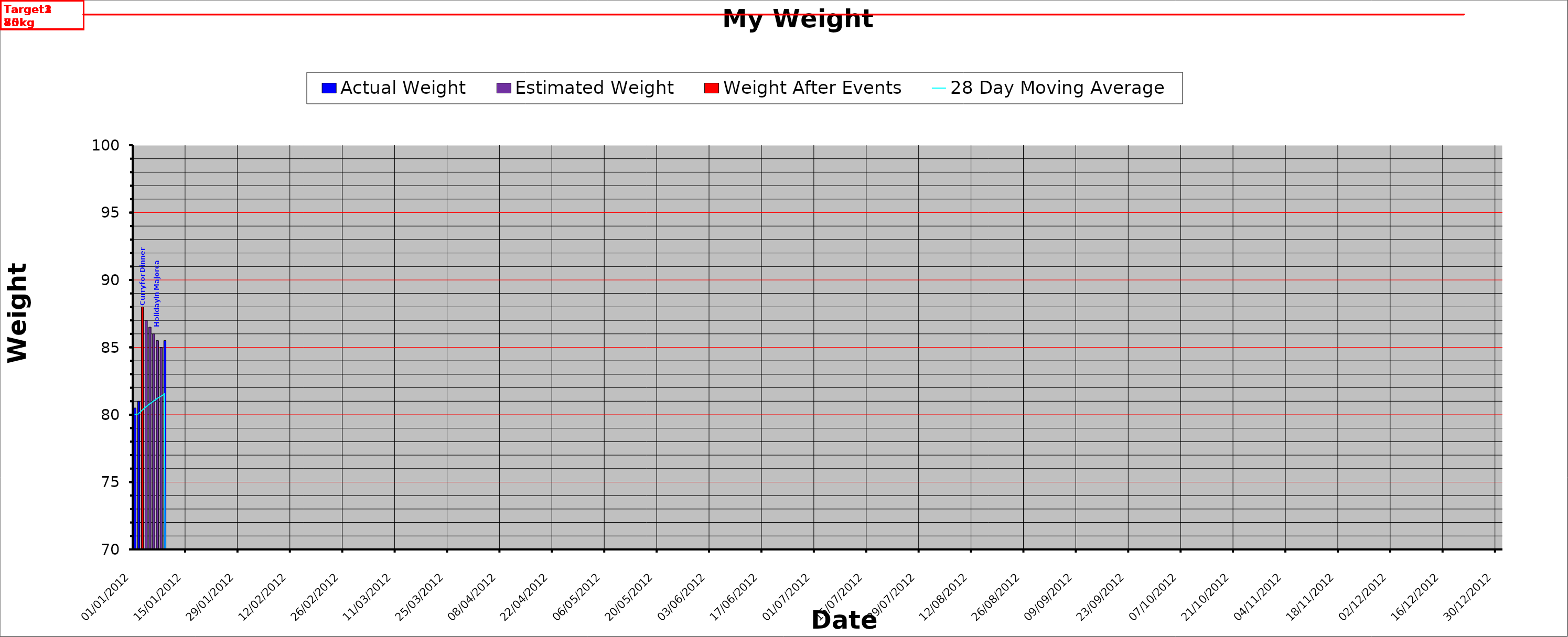
| Category | Actual Weight | Estimated Weight | Weight After Events |
|---|---|---|---|
| 01/01/2012 | 80.5 | 0 | 0 |
| 02/01/2012 | 81 | 0 | 0 |
| 03/01/2012 | 0 | 0 | 88 |
| 04/01/2012 | 0 | 87 | 0 |
| 05/01/2012 | 0 | 86.5 | 0 |
| 06/01/2012 | 0 | 86 | 0 |
| 07/01/2012 | 0 | 85.5 | 0 |
| 08/01/2012 | 0 | 85 | 0 |
| 09/01/2012 | 85.5 | 0 | 0 |
| 10/01/2012 | 0 | 0 | 0 |
| 11/01/2012 | 0 | 0 | 0 |
| 12/01/2012 | 0 | 0 | 0 |
| 13/01/2012 | 0 | 0 | 0 |
| 14/01/2012 | 0 | 0 | 0 |
| 15/01/2012 | 0 | 0 | 0 |
| 16/01/2012 | 0 | 0 | 0 |
| 17/01/2012 | 0 | 0 | 0 |
| 18/01/2012 | 0 | 0 | 0 |
| 19/01/2012 | 0 | 0 | 0 |
| 20/01/2012 | 0 | 0 | 0 |
| 21/01/2012 | 0 | 0 | 0 |
| 22/01/2012 | 0 | 0 | 0 |
| 23/01/2012 | 0 | 0 | 0 |
| 24/01/2012 | 0 | 0 | 0 |
| 25/01/2012 | 0 | 0 | 0 |
| 26/01/2012 | 0 | 0 | 0 |
| 27/01/2012 | 0 | 0 | 0 |
| 28/01/2012 | 0 | 0 | 0 |
| 29/01/2012 | 0 | 0 | 0 |
| 30/01/2012 | 0 | 0 | 0 |
| 31/01/2012 | 0 | 0 | 0 |
| 01/02/2012 | 0 | 0 | 0 |
| 02/02/2012 | 0 | 0 | 0 |
| 03/02/2012 | 0 | 0 | 0 |
| 04/02/2012 | 0 | 0 | 0 |
| 05/02/2012 | 0 | 0 | 0 |
| 06/02/2012 | 0 | 0 | 0 |
| 07/02/2012 | 0 | 0 | 0 |
| 08/02/2012 | 0 | 0 | 0 |
| 09/02/2012 | 0 | 0 | 0 |
| 10/02/2012 | 0 | 0 | 0 |
| 11/02/2012 | 0 | 0 | 0 |
| 12/02/2012 | 0 | 0 | 0 |
| 13/02/2012 | 0 | 0 | 0 |
| 14/02/2012 | 0 | 0 | 0 |
| 15/02/2012 | 0 | 0 | 0 |
| 16/02/2012 | 0 | 0 | 0 |
| 17/02/2012 | 0 | 0 | 0 |
| 18/02/2012 | 0 | 0 | 0 |
| 19/02/2012 | 0 | 0 | 0 |
| 20/02/2012 | 0 | 0 | 0 |
| 21/02/2012 | 0 | 0 | 0 |
| 22/02/2012 | 0 | 0 | 0 |
| 23/02/2012 | 0 | 0 | 0 |
| 24/02/2012 | 0 | 0 | 0 |
| 25/02/2012 | 0 | 0 | 0 |
| 26/02/2012 | 0 | 0 | 0 |
| 27/02/2012 | 0 | 0 | 0 |
| 28/02/2012 | 0 | 0 | 0 |
| 29/02/2012 | 0 | 0 | 0 |
| 01/03/2012 | 0 | 0 | 0 |
| 02/03/2012 | 0 | 0 | 0 |
| 03/03/2012 | 0 | 0 | 0 |
| 04/03/2012 | 0 | 0 | 0 |
| 05/03/2012 | 0 | 0 | 0 |
| 06/03/2012 | 0 | 0 | 0 |
| 07/03/2012 | 0 | 0 | 0 |
| 08/03/2012 | 0 | 0 | 0 |
| 09/03/2012 | 0 | 0 | 0 |
| 10/03/2012 | 0 | 0 | 0 |
| 11/03/2012 | 0 | 0 | 0 |
| 12/03/2012 | 0 | 0 | 0 |
| 13/03/2012 | 0 | 0 | 0 |
| 14/03/2012 | 0 | 0 | 0 |
| 15/03/2012 | 0 | 0 | 0 |
| 16/03/2012 | 0 | 0 | 0 |
| 17/03/2012 | 0 | 0 | 0 |
| 18/03/2012 | 0 | 0 | 0 |
| 19/03/2012 | 0 | 0 | 0 |
| 20/03/2012 | 0 | 0 | 0 |
| 21/03/2012 | 0 | 0 | 0 |
| 22/03/2012 | 0 | 0 | 0 |
| 23/03/2012 | 0 | 0 | 0 |
| 24/03/2012 | 0 | 0 | 0 |
| 25/03/2012 | 0 | 0 | 0 |
| 26/03/2012 | 0 | 0 | 0 |
| 27/03/2012 | 0 | 0 | 0 |
| 28/03/2012 | 0 | 0 | 0 |
| 29/03/2012 | 0 | 0 | 0 |
| 30/03/2012 | 0 | 0 | 0 |
| 31/03/2012 | 0 | 0 | 0 |
| 01/04/2012 | 0 | 0 | 0 |
| 02/04/2012 | 0 | 0 | 0 |
| 03/04/2012 | 0 | 0 | 0 |
| 04/04/2012 | 0 | 0 | 0 |
| 05/04/2012 | 0 | 0 | 0 |
| 06/04/2012 | 0 | 0 | 0 |
| 07/04/2012 | 0 | 0 | 0 |
| 08/04/2012 | 0 | 0 | 0 |
| 09/04/2012 | 0 | 0 | 0 |
| 10/04/2012 | 0 | 0 | 0 |
| 11/04/2012 | 0 | 0 | 0 |
| 12/04/2012 | 0 | 0 | 0 |
| 13/04/2012 | 0 | 0 | 0 |
| 14/04/2012 | 0 | 0 | 0 |
| 15/04/2012 | 0 | 0 | 0 |
| 16/04/2012 | 0 | 0 | 0 |
| 17/04/2012 | 0 | 0 | 0 |
| 18/04/2012 | 0 | 0 | 0 |
| 19/04/2012 | 0 | 0 | 0 |
| 20/04/2012 | 0 | 0 | 0 |
| 21/04/2012 | 0 | 0 | 0 |
| 22/04/2012 | 0 | 0 | 0 |
| 23/04/2012 | 0 | 0 | 0 |
| 24/04/2012 | 0 | 0 | 0 |
| 25/04/2012 | 0 | 0 | 0 |
| 26/04/2012 | 0 | 0 | 0 |
| 27/04/2012 | 0 | 0 | 0 |
| 28/04/2012 | 0 | 0 | 0 |
| 29/04/2012 | 0 | 0 | 0 |
| 30/04/2012 | 0 | 0 | 0 |
| 01/05/2012 | 0 | 0 | 0 |
| 02/05/2012 | 0 | 0 | 0 |
| 03/05/2012 | 0 | 0 | 0 |
| 04/05/2012 | 0 | 0 | 0 |
| 05/05/2012 | 0 | 0 | 0 |
| 06/05/2012 | 0 | 0 | 0 |
| 07/05/2012 | 0 | 0 | 0 |
| 08/05/2012 | 0 | 0 | 0 |
| 09/05/2012 | 0 | 0 | 0 |
| 10/05/2012 | 0 | 0 | 0 |
| 11/05/2012 | 0 | 0 | 0 |
| 12/05/2012 | 0 | 0 | 0 |
| 13/05/2012 | 0 | 0 | 0 |
| 14/05/2012 | 0 | 0 | 0 |
| 15/05/2012 | 0 | 0 | 0 |
| 16/05/2012 | 0 | 0 | 0 |
| 17/05/2012 | 0 | 0 | 0 |
| 18/05/2012 | 0 | 0 | 0 |
| 19/05/2012 | 0 | 0 | 0 |
| 20/05/2012 | 0 | 0 | 0 |
| 21/05/2012 | 0 | 0 | 0 |
| 22/05/2012 | 0 | 0 | 0 |
| 23/05/2012 | 0 | 0 | 0 |
| 24/05/2012 | 0 | 0 | 0 |
| 25/05/2012 | 0 | 0 | 0 |
| 26/05/2012 | 0 | 0 | 0 |
| 27/05/2012 | 0 | 0 | 0 |
| 28/05/2012 | 0 | 0 | 0 |
| 29/05/2012 | 0 | 0 | 0 |
| 30/05/2012 | 0 | 0 | 0 |
| 31/05/2012 | 0 | 0 | 0 |
| 01/06/2012 | 0 | 0 | 0 |
| 02/06/2012 | 0 | 0 | 0 |
| 03/06/2012 | 0 | 0 | 0 |
| 04/06/2012 | 0 | 0 | 0 |
| 05/06/2012 | 0 | 0 | 0 |
| 06/06/2012 | 0 | 0 | 0 |
| 07/06/2012 | 0 | 0 | 0 |
| 08/06/2012 | 0 | 0 | 0 |
| 09/06/2012 | 0 | 0 | 0 |
| 10/06/2012 | 0 | 0 | 0 |
| 11/06/2012 | 0 | 0 | 0 |
| 12/06/2012 | 0 | 0 | 0 |
| 13/06/2012 | 0 | 0 | 0 |
| 14/06/2012 | 0 | 0 | 0 |
| 15/06/2012 | 0 | 0 | 0 |
| 16/06/2012 | 0 | 0 | 0 |
| 17/06/2012 | 0 | 0 | 0 |
| 18/06/2012 | 0 | 0 | 0 |
| 19/06/2012 | 0 | 0 | 0 |
| 20/06/2012 | 0 | 0 | 0 |
| 21/06/2012 | 0 | 0 | 0 |
| 22/06/2012 | 0 | 0 | 0 |
| 23/06/2012 | 0 | 0 | 0 |
| 24/06/2012 | 0 | 0 | 0 |
| 25/06/2012 | 0 | 0 | 0 |
| 26/06/2012 | 0 | 0 | 0 |
| 27/06/2012 | 0 | 0 | 0 |
| 28/06/2012 | 0 | 0 | 0 |
| 29/06/2012 | 0 | 0 | 0 |
| 30/06/2012 | 0 | 0 | 0 |
| 01/07/2012 | 0 | 0 | 0 |
| 02/07/2012 | 0 | 0 | 0 |
| 03/07/2012 | 0 | 0 | 0 |
| 04/07/2012 | 0 | 0 | 0 |
| 05/07/2012 | 0 | 0 | 0 |
| 06/07/2012 | 0 | 0 | 0 |
| 07/07/2012 | 0 | 0 | 0 |
| 08/07/2012 | 0 | 0 | 0 |
| 09/07/2012 | 0 | 0 | 0 |
| 10/07/2012 | 0 | 0 | 0 |
| 11/07/2012 | 0 | 0 | 0 |
| 12/07/2012 | 0 | 0 | 0 |
| 13/07/2012 | 0 | 0 | 0 |
| 14/07/2012 | 0 | 0 | 0 |
| 15/07/2012 | 0 | 0 | 0 |
| 16/07/2012 | 0 | 0 | 0 |
| 17/07/2012 | 0 | 0 | 0 |
| 18/07/2012 | 0 | 0 | 0 |
| 19/07/2012 | 0 | 0 | 0 |
| 20/07/2012 | 0 | 0 | 0 |
| 21/07/2012 | 0 | 0 | 0 |
| 22/07/2012 | 0 | 0 | 0 |
| 23/07/2012 | 0 | 0 | 0 |
| 24/07/2012 | 0 | 0 | 0 |
| 25/07/2012 | 0 | 0 | 0 |
| 26/07/2012 | 0 | 0 | 0 |
| 27/07/2012 | 0 | 0 | 0 |
| 28/07/2012 | 0 | 0 | 0 |
| 29/07/2012 | 0 | 0 | 0 |
| 30/07/2012 | 0 | 0 | 0 |
| 31/07/2012 | 0 | 0 | 0 |
| 01/08/2012 | 0 | 0 | 0 |
| 02/08/2012 | 0 | 0 | 0 |
| 03/08/2012 | 0 | 0 | 0 |
| 04/08/2012 | 0 | 0 | 0 |
| 05/08/2012 | 0 | 0 | 0 |
| 06/08/2012 | 0 | 0 | 0 |
| 07/08/2012 | 0 | 0 | 0 |
| 08/08/2012 | 0 | 0 | 0 |
| 09/08/2012 | 0 | 0 | 0 |
| 10/08/2012 | 0 | 0 | 0 |
| 11/08/2012 | 0 | 0 | 0 |
| 12/08/2012 | 0 | 0 | 0 |
| 13/08/2012 | 0 | 0 | 0 |
| 14/08/2012 | 0 | 0 | 0 |
| 15/08/2012 | 0 | 0 | 0 |
| 16/08/2012 | 0 | 0 | 0 |
| 17/08/2012 | 0 | 0 | 0 |
| 18/08/2012 | 0 | 0 | 0 |
| 19/08/2012 | 0 | 0 | 0 |
| 20/08/2012 | 0 | 0 | 0 |
| 21/08/2012 | 0 | 0 | 0 |
| 22/08/2012 | 0 | 0 | 0 |
| 23/08/2012 | 0 | 0 | 0 |
| 24/08/2012 | 0 | 0 | 0 |
| 25/08/2012 | 0 | 0 | 0 |
| 26/08/2012 | 0 | 0 | 0 |
| 27/08/2012 | 0 | 0 | 0 |
| 28/08/2012 | 0 | 0 | 0 |
| 29/08/2012 | 0 | 0 | 0 |
| 30/08/2012 | 0 | 0 | 0 |
| 31/08/2012 | 0 | 0 | 0 |
| 01/09/2012 | 0 | 0 | 0 |
| 02/09/2012 | 0 | 0 | 0 |
| 03/09/2012 | 0 | 0 | 0 |
| 04/09/2012 | 0 | 0 | 0 |
| 05/09/2012 | 0 | 0 | 0 |
| 06/09/2012 | 0 | 0 | 0 |
| 07/09/2012 | 0 | 0 | 0 |
| 08/09/2012 | 0 | 0 | 0 |
| 09/09/2012 | 0 | 0 | 0 |
| 10/09/2012 | 0 | 0 | 0 |
| 11/09/2012 | 0 | 0 | 0 |
| 12/09/2012 | 0 | 0 | 0 |
| 13/09/2012 | 0 | 0 | 0 |
| 14/09/2012 | 0 | 0 | 0 |
| 15/09/2012 | 0 | 0 | 0 |
| 16/09/2012 | 0 | 0 | 0 |
| 17/09/2012 | 0 | 0 | 0 |
| 18/09/2012 | 0 | 0 | 0 |
| 19/09/2012 | 0 | 0 | 0 |
| 20/09/2012 | 0 | 0 | 0 |
| 21/09/2012 | 0 | 0 | 0 |
| 22/09/2012 | 0 | 0 | 0 |
| 23/09/2012 | 0 | 0 | 0 |
| 24/09/2012 | 0 | 0 | 0 |
| 25/09/2012 | 0 | 0 | 0 |
| 26/09/2012 | 0 | 0 | 0 |
| 27/09/2012 | 0 | 0 | 0 |
| 28/09/2012 | 0 | 0 | 0 |
| 29/09/2012 | 0 | 0 | 0 |
| 30/09/2012 | 0 | 0 | 0 |
| 01/10/2012 | 0 | 0 | 0 |
| 02/10/2012 | 0 | 0 | 0 |
| 03/10/2012 | 0 | 0 | 0 |
| 04/10/2012 | 0 | 0 | 0 |
| 05/10/2012 | 0 | 0 | 0 |
| 06/10/2012 | 0 | 0 | 0 |
| 07/10/2012 | 0 | 0 | 0 |
| 08/10/2012 | 0 | 0 | 0 |
| 09/10/2012 | 0 | 0 | 0 |
| 10/10/2012 | 0 | 0 | 0 |
| 11/10/2012 | 0 | 0 | 0 |
| 12/10/2012 | 0 | 0 | 0 |
| 13/10/2012 | 0 | 0 | 0 |
| 14/10/2012 | 0 | 0 | 0 |
| 15/10/2012 | 0 | 0 | 0 |
| 16/10/2012 | 0 | 0 | 0 |
| 17/10/2012 | 0 | 0 | 0 |
| 18/10/2012 | 0 | 0 | 0 |
| 19/10/2012 | 0 | 0 | 0 |
| 20/10/2012 | 0 | 0 | 0 |
| 21/10/2012 | 0 | 0 | 0 |
| 22/10/2012 | 0 | 0 | 0 |
| 23/10/2012 | 0 | 0 | 0 |
| 24/10/2012 | 0 | 0 | 0 |
| 25/10/2012 | 0 | 0 | 0 |
| 26/10/2012 | 0 | 0 | 0 |
| 27/10/2012 | 0 | 0 | 0 |
| 28/10/2012 | 0 | 0 | 0 |
| 29/10/2012 | 0 | 0 | 0 |
| 30/10/2012 | 0 | 0 | 0 |
| 31/10/2012 | 0 | 0 | 0 |
| 01/11/2012 | 0 | 0 | 0 |
| 02/11/2012 | 0 | 0 | 0 |
| 03/11/2012 | 0 | 0 | 0 |
| 04/11/2012 | 0 | 0 | 0 |
| 05/11/2012 | 0 | 0 | 0 |
| 06/11/2012 | 0 | 0 | 0 |
| 07/11/2012 | 0 | 0 | 0 |
| 08/11/2012 | 0 | 0 | 0 |
| 09/11/2012 | 0 | 0 | 0 |
| 10/11/2012 | 0 | 0 | 0 |
| 11/11/2012 | 0 | 0 | 0 |
| 12/11/2012 | 0 | 0 | 0 |
| 13/11/2012 | 0 | 0 | 0 |
| 14/11/2012 | 0 | 0 | 0 |
| 15/11/2012 | 0 | 0 | 0 |
| 16/11/2012 | 0 | 0 | 0 |
| 17/11/2012 | 0 | 0 | 0 |
| 18/11/2012 | 0 | 0 | 0 |
| 19/11/2012 | 0 | 0 | 0 |
| 20/11/2012 | 0 | 0 | 0 |
| 21/11/2012 | 0 | 0 | 0 |
| 22/11/2012 | 0 | 0 | 0 |
| 23/11/2012 | 0 | 0 | 0 |
| 24/11/2012 | 0 | 0 | 0 |
| 25/11/2012 | 0 | 0 | 0 |
| 26/11/2012 | 0 | 0 | 0 |
| 27/11/2012 | 0 | 0 | 0 |
| 28/11/2012 | 0 | 0 | 0 |
| 29/11/2012 | 0 | 0 | 0 |
| 30/11/2012 | 0 | 0 | 0 |
| 01/12/2012 | 0 | 0 | 0 |
| 02/12/2012 | 0 | 0 | 0 |
| 03/12/2012 | 0 | 0 | 0 |
| 04/12/2012 | 0 | 0 | 0 |
| 05/12/2012 | 0 | 0 | 0 |
| 06/12/2012 | 0 | 0 | 0 |
| 07/12/2012 | 0 | 0 | 0 |
| 08/12/2012 | 0 | 0 | 0 |
| 09/12/2012 | 0 | 0 | 0 |
| 10/12/2012 | 0 | 0 | 0 |
| 11/12/2012 | 0 | 0 | 0 |
| 12/12/2012 | 0 | 0 | 0 |
| 13/12/2012 | 0 | 0 | 0 |
| 14/12/2012 | 0 | 0 | 0 |
| 15/12/2012 | 0 | 0 | 0 |
| 16/12/2012 | 0 | 0 | 0 |
| 17/12/2012 | 0 | 0 | 0 |
| 18/12/2012 | 0 | 0 | 0 |
| 19/12/2012 | 0 | 0 | 0 |
| 20/12/2012 | 0 | 0 | 0 |
| 21/12/2012 | 0 | 0 | 0 |
| 22/12/2012 | 0 | 0 | 0 |
| 23/12/2012 | 0 | 0 | 0 |
| 24/12/2012 | 0 | 0 | 0 |
| 25/12/2012 | 0 | 0 | 0 |
| 26/12/2012 | 0 | 0 | 0 |
| 27/12/2012 | 0 | 0 | 0 |
| 28/12/2012 | 0 | 0 | 0 |
| 29/12/2012 | 0 | 0 | 0 |
| 30/12/2012 | 0 | 0 | 0 |
| 31/12/2012 | 0 | 0 | 0 |